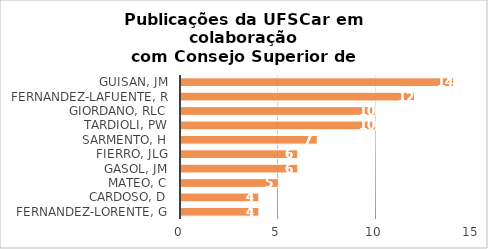
| Category | # Records |
|---|---|
| GUISAN, JM | 14 |
| FERNANDEZ-LAFUENTE, R | 12 |
| GIORDANO, RLC | 10 |
| TARDIOLI, PW | 10 |
| SARMENTO, H | 7 |
| FIERRO, JLG | 6 |
| GASOL, JM | 6 |
| MATEO, C | 5 |
| CARDOSO, D | 4 |
| FERNANDEZ-LORENTE, G | 4 |